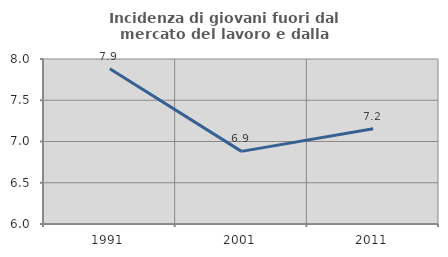
| Category | Incidenza di giovani fuori dal mercato del lavoro e dalla formazione  |
|---|---|
| 1991.0 | 7.883 |
| 2001.0 | 6.88 |
| 2011.0 | 7.156 |